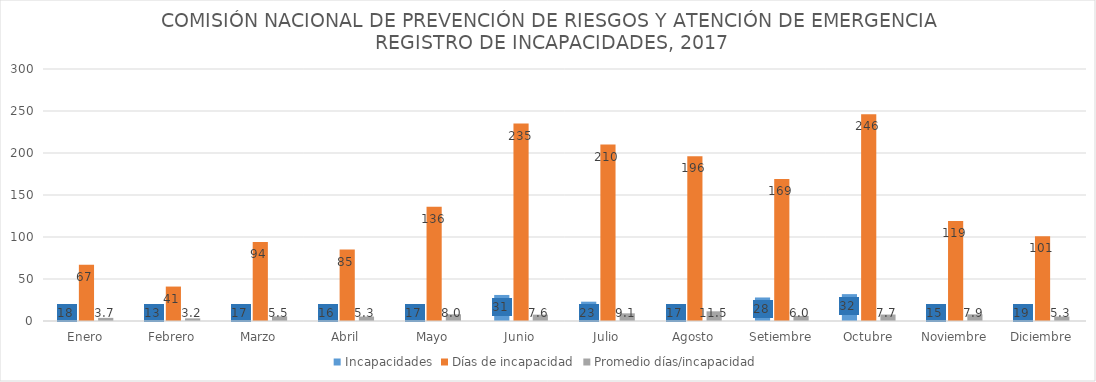
| Category | Incapacidades | Días de incapacidad | Promedio días/incapacidad |
|---|---|---|---|
| Enero | 18 | 67 | 3.722 |
| Febrero | 13 | 41 | 3.154 |
| Marzo | 17 | 94 | 5.529 |
| Abril | 16 | 85 | 5.312 |
| Mayo | 17 | 136 | 8 |
| Junio | 31 | 235 | 7.581 |
| Julio | 23 | 210 | 9.13 |
| Agosto | 17 | 196 | 11.529 |
| Setiembre | 28 | 169 | 6.036 |
| Octubre | 32 | 246 | 7.688 |
| Noviembre | 15 | 119 | 7.933 |
| Diciembre | 19 | 101 | 5.316 |